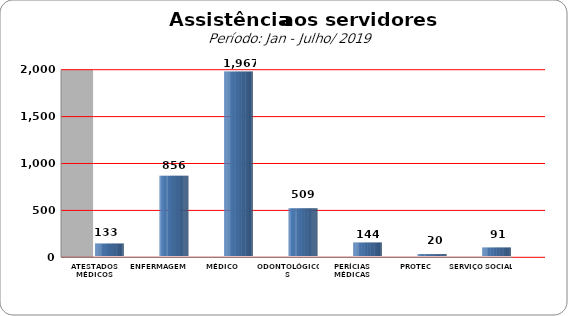
| Category | Series 0 |
|---|---|
| ATESTADOS MÉDICOS | 133 |
| ENFERMAGEM | 856 |
| MÉDICO | 1967 |
| ODONTOLÓGICOS | 509 |
| PERÍCIAS MÉDICAS | 144 |
| PROTEC | 20 |
| SERVIÇO SOCIAL | 91 |